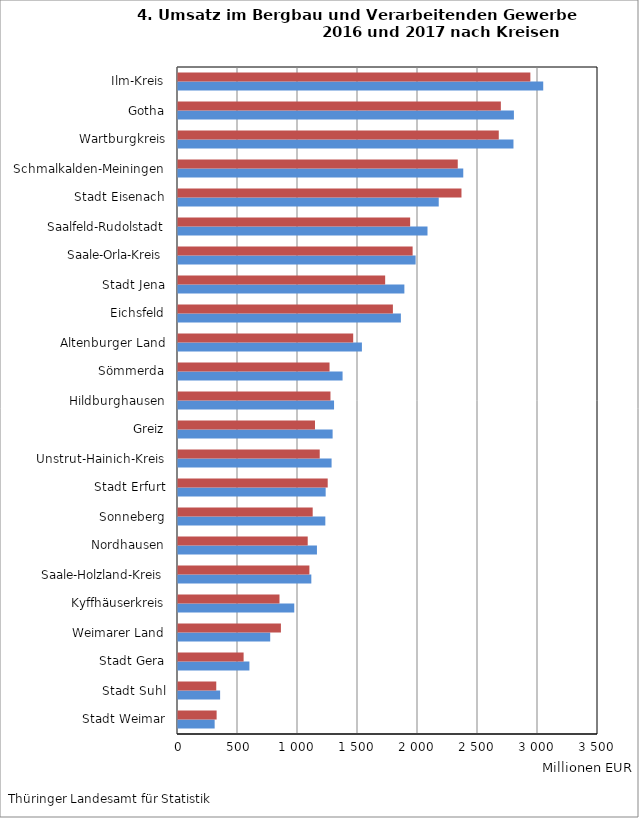
| Category | 2017 | 2016 |
|---|---|---|
| Stadt Weimar | 305.491 | 321.87 |
| Stadt Suhl | 350.993 | 318.85 |
| Stadt Gera | 595.112 | 546.748 |
| Weimarer Land | 768.309 | 857.61 |
| Kyffhäuserkreis | 968.833 | 845.803 |
| Saale-Holzland-Kreis | 1111.062 | 1094.975 |
| Nordhausen | 1157.94 | 1080.979 |
| Sonneberg | 1227.712 | 1122.41 |
| Stadt Erfurt | 1230.598 | 1247.532 |
| Unstrut-Hainich-Kreis | 1279.89 | 1181.084 |
| Greiz | 1288.529 | 1141.64 |
| Hildburghausen | 1300.401 | 1270.586 |
| Sömmerda | 1371.479 | 1262.778 |
| Altenburger Land | 1532.561 | 1459.972 |
| Eichsfeld | 1857.313 | 1790.82 |
| Stadt Jena | 1886.441 | 1726.359 |
| Saale-Orla-Kreis | 1980.142 | 1955.195 |
| Saalfeld-Rudolstadt | 2079.156 | 1934.615 |
| Stadt Eisenach | 2172.788 | 2362.242 |
| Schmalkalden-Meiningen | 2377.205 | 2331.278 |
| Wartburgkreis | 2795.523 | 2673.091 |
| Gotha | 2799.165 | 2690.489 |
| Ilm-Kreis | 3043.533 | 2936.315 |